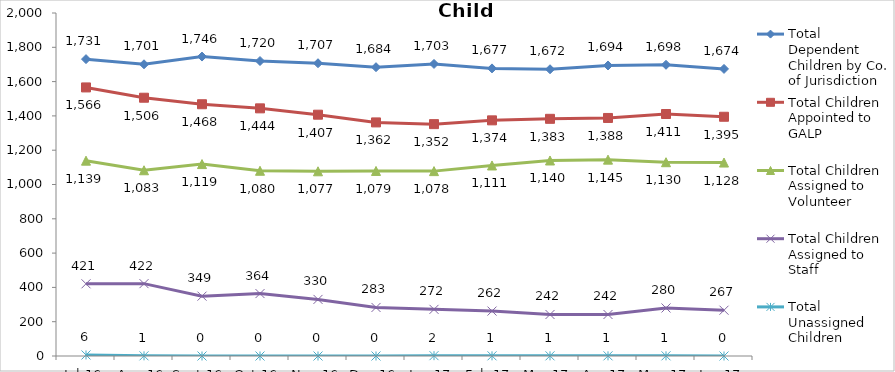
| Category | Total Dependent Children by Co. of Jurisdiction | Total Children Appointed to GALP | Total Children Assigned to Volunteer | Total Children Assigned to Staff | Total Unassigned Children |
|---|---|---|---|---|---|
| Jul-16 | 1731 | 1566 | 1139 | 421 | 6 |
| Aug-16 | 1701 | 1506 | 1083 | 422 | 1 |
| Sep-16 | 1746 | 1468 | 1119 | 349 | 0 |
| Oct-16 | 1720 | 1444 | 1080 | 364 | 0 |
| Nov-16 | 1707 | 1407 | 1077 | 330 | 0 |
| Dec-16 | 1684 | 1362 | 1079 | 283 | 0 |
| Jan-17 | 1703 | 1352 | 1078 | 272 | 2 |
| Feb-17 | 1677 | 1374 | 1111 | 262 | 1 |
| Mar-17 | 1672 | 1383 | 1140 | 242 | 1 |
| Apr-17 | 1694 | 1388 | 1145 | 242 | 1 |
| May-17 | 1698 | 1411 | 1130 | 280 | 1 |
| Jun-17 | 1674 | 1395 | 1128 | 267 | 0 |